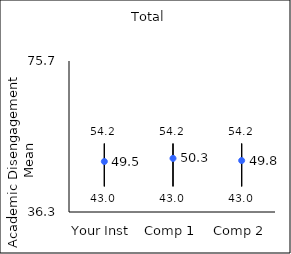
| Category | 25th percentile | 75th percentile | Mean |
|---|---|---|---|
| Your Inst | 43 | 54.2 | 49.51 |
| Comp 1 | 43 | 54.2 | 50.33 |
| Comp 2 | 43 | 54.2 | 49.76 |